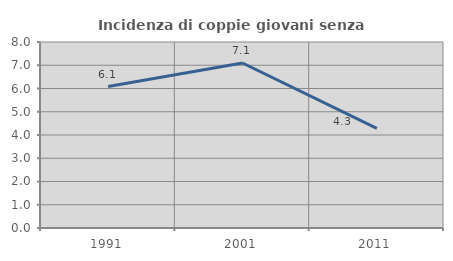
| Category | Incidenza di coppie giovani senza figli |
|---|---|
| 1991.0 | 6.085 |
| 2001.0 | 7.096 |
| 2011.0 | 4.285 |